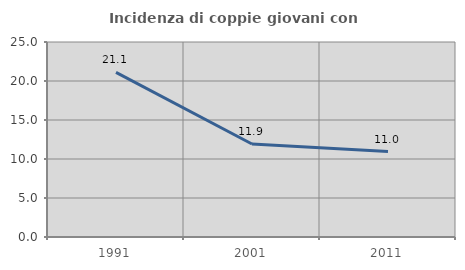
| Category | Incidenza di coppie giovani con figli |
|---|---|
| 1991.0 | 21.097 |
| 2001.0 | 11.927 |
| 2011.0 | 10.95 |